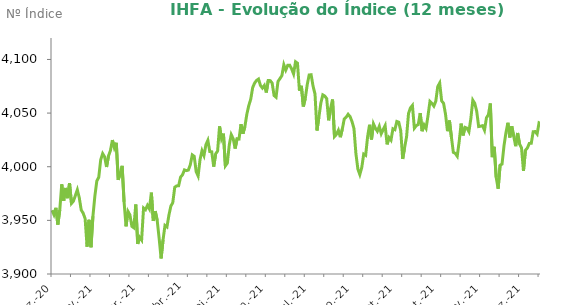
| Category | Series 0 |
|---|---|
| 2020-12-31 | 3959.42 |
| 2021-01-04 | 3955.28 |
| 2021-01-05 | 3961.68 |
| 2021-01-06 | 3946.08 |
| 2021-01-07 | 3959.91 |
| 2021-01-08 | 3983.61 |
| 2021-01-11 | 3968.18 |
| 2021-01-12 | 3980.22 |
| 2021-01-13 | 3970.68 |
| 2021-01-14 | 3984.72 |
| 2021-01-15 | 3965.79 |
| 2021-01-18 | 3967.89 |
| 2021-01-19 | 3973.23 |
| 2021-01-20 | 3978.48 |
| 2021-01-21 | 3971.03 |
| 2021-01-22 | 3959.66 |
| 2021-01-25 | 3956.69 |
| 2021-01-26 | 3951.66 |
| 2021-01-27 | 3925.52 |
| 2021-01-28 | 3950.5 |
| 2021-01-29 | 3924.94 |
| 2021-02-01 | 3953.82 |
| 2021-02-02 | 3972.6 |
| 2021-02-03 | 3986.69 |
| 2021-02-04 | 3990.2 |
| 2021-02-05 | 4006.56 |
| 2021-02-08 | 4012.28 |
| 2021-02-09 | 4009.25 |
| 2021-02-10 | 3999.73 |
| 2021-02-11 | 4010.06 |
| 2021-02-12 | 4015.12 |
| 2021-02-17 | 4024.82 |
| 2021-02-18 | 4017.66 |
| 2021-02-19 | 4022.34 |
| 2021-02-22 | 3987.76 |
| 2021-02-23 | 3993.76 |
| 2021-02-24 | 4000.86 |
| 2021-02-25 | 3967.23 |
| 2021-02-26 | 3944.47 |
| 2021-03-01 | 3958.31 |
| 2021-03-02 | 3955.07 |
| 2021-03-03 | 3944.44 |
| 2021-03-04 | 3943.1 |
| 2021-03-05 | 3964.81 |
| 2021-03-08 | 3928.07 |
| 2021-03-09 | 3934.21 |
| 2021-03-10 | 3931.67 |
| 2021-03-11 | 3961.52 |
| 2021-03-12 | 3959.95 |
| 2021-03-15 | 3963.95 |
| 2021-03-16 | 3960.68 |
| 2021-03-17 | 3975.84 |
| 2021-03-18 | 3949.49 |
| 2021-03-19 | 3958.61 |
| 2021-03-22 | 3949.93 |
| 2021-03-23 | 3933.15 |
| 2021-03-24 | 3914.5 |
| 2021-03-25 | 3931.89 |
| 2021-03-26 | 3945.28 |
| 2021-03-29 | 3943.87 |
| 2021-03-30 | 3954.78 |
| 2021-03-31 | 3963.24 |
| 2021-04-01 | 3966.52 |
| 2021-04-05 | 3980.85 |
| 2021-04-06 | 3982.14 |
| 2021-04-07 | 3982.23 |
| 2021-04-08 | 3990.34 |
| 2021-04-09 | 3992.5 |
| 2021-04-12 | 3997.03 |
| 2021-04-13 | 3996.38 |
| 2021-04-14 | 3996.89 |
| 2021-04-15 | 4001.89 |
| 2021-04-16 | 4011.06 |
| 2021-04-19 | 4009.7 |
| 2021-04-20 | 3995.43 |
| 2021-04-22 | 3991.36 |
| 2021-04-23 | 4006.88 |
| 2021-04-26 | 4014.86 |
| 2021-04-27 | 4010.42 |
| 2021-04-28 | 4020.49 |
| 2021-04-29 | 4024.6 |
| 2021-04-30 | 4014.13 |
| 2021-05-03 | 4013.92 |
| 2021-05-04 | 4000.09 |
| 2021-05-05 | 4012 |
| 2021-05-06 | 4014.61 |
| 2021-05-07 | 4037.62 |
| 2021-05-10 | 4026.17 |
| 2021-05-11 | 4030.82 |
| 2021-05-12 | 4000.86 |
| 2021-05-13 | 4003.37 |
| 2021-05-14 | 4020.47 |
| 2021-05-17 | 4029.9 |
| 2021-05-18 | 4026.19 |
| 2021-05-19 | 4016.94 |
| 2021-05-20 | 4026.11 |
| 2021-05-21 | 4025.85 |
| 2021-05-24 | 4039.62 |
| 2021-05-25 | 4030.75 |
| 2021-05-26 | 4037.36 |
| 2021-05-27 | 4048.85 |
| 2021-05-28 | 4056.99 |
| 2021-05-31 | 4062.88 |
| 2021-06-01 | 4073.78 |
| 2021-06-02 | 4078.02 |
| 2021-06-04 | 4080.46 |
| 2021-06-07 | 4081.73 |
| 2021-06-08 | 4075.77 |
| 2021-06-09 | 4073.34 |
| 2021-06-10 | 4075.79 |
| 2021-06-11 | 4069.2 |
| 2021-06-14 | 4080.4 |
| 2021-06-15 | 4080.27 |
| 2021-06-16 | 4077.96 |
| 2021-06-17 | 4066.35 |
| 2021-06-18 | 4064.81 |
| 2021-06-21 | 4079.53 |
| 2021-06-22 | 4082.14 |
| 2021-06-23 | 4084.93 |
| 2021-06-24 | 4095.07 |
| 2021-06-25 | 4090.09 |
| 2021-06-28 | 4094.54 |
| 2021-06-29 | 4094.67 |
| 2021-06-30 | 4091.19 |
| 2021-07-01 | 4086.52 |
| 2021-07-02 | 4097.86 |
| 2021-07-05 | 4096.51 |
| 2021-07-06 | 4070.87 |
| 2021-07-07 | 4075.44 |
| 2021-07-08 | 4056.16 |
| 2021-07-09 | 4063.56 |
| 2021-07-12 | 4076.5 |
| 2021-07-13 | 4085.56 |
| 2021-07-14 | 4085.78 |
| 2021-07-15 | 4075.11 |
| 2021-07-16 | 4067.77 |
| 2021-07-19 | 4033.75 |
| 2021-07-20 | 4046.31 |
| 2021-07-21 | 4059.3 |
| 2021-07-22 | 4066.98 |
| 2021-07-23 | 4065.91 |
| 2021-07-26 | 4063.49 |
| 2021-07-27 | 4043.27 |
| 2021-07-28 | 4054.41 |
| 2021-07-29 | 4062.71 |
| 2021-07-30 | 4028.14 |
| 2021-08-02 | 4030.13 |
| 2021-08-03 | 4033.93 |
| 2021-08-04 | 4027.52 |
| 2021-08-05 | 4034.98 |
| 2021-08-06 | 4044.43 |
| 2021-08-09 | 4046.2 |
| 2021-08-10 | 4048.89 |
| 2021-08-11 | 4046.7 |
| 2021-08-12 | 4042.07 |
| 2021-08-13 | 4035.54 |
| 2021-08-16 | 4012.2 |
| 2021-08-17 | 3997.84 |
| 2021-08-18 | 3992.73 |
| 2021-08-19 | 3999.27 |
| 2021-08-20 | 4011.78 |
| 2021-08-23 | 4010.67 |
| 2021-08-24 | 4028.05 |
| 2021-08-25 | 4039.1 |
| 2021-08-26 | 4025.41 |
| 2021-08-27 | 4040.01 |
| 2021-08-30 | 4035.92 |
| 2021-08-31 | 4033.08 |
| 2021-09-01 | 4037.66 |
| 2021-09-02 | 4030.79 |
| 2021-09-03 | 4034.61 |
| 2021-09-06 | 4038.27 |
| 2021-09-08 | 4020.87 |
| 2021-09-09 | 4027.15 |
| 2021-09-10 | 4024.8 |
| 2021-09-13 | 4035.39 |
| 2021-09-14 | 4034.54 |
| 2021-09-15 | 4042.17 |
| 2021-09-16 | 4041.49 |
| 2021-09-17 | 4033.61 |
| 2021-09-20 | 4007.25 |
| 2021-09-21 | 4018.04 |
| 2021-09-22 | 4027.91 |
| 2021-09-23 | 4049.69 |
| 2021-09-24 | 4054.89 |
| 2021-09-27 | 4057.13 |
| 2021-09-28 | 4035.95 |
| 2021-09-29 | 4038.34 |
| 2021-09-30 | 4039.3 |
| 2021-10-01 | 4050.05 |
| 2021-10-04 | 4033.15 |
| 2021-10-05 | 4038.94 |
| 2021-10-06 | 4035.78 |
| 2021-10-07 | 4047.57 |
| 2021-10-08 | 4060.84 |
| 2021-10-11 | 4059.07 |
| 2021-10-13 | 4056.52 |
| 2021-10-14 | 4061.11 |
| 2021-10-15 | 4074.77 |
| 2021-10-18 | 4078.05 |
| 2021-10-19 | 4061.42 |
| 2021-10-20 | 4059.05 |
| 2021-10-21 | 4048.86 |
| 2021-10-22 | 4033.16 |
| 2021-10-25 | 4043.06 |
| 2021-10-26 | 4027.86 |
| 2021-10-27 | 4013.41 |
| 2021-10-28 | 4012.41 |
| 2021-10-29 | 4009.78 |
| 2021-11-01 | 4023.42 |
| 2021-11-03 | 4040.16 |
| 2021-11-04 | 4029.18 |
| 2021-11-05 | 4036.69 |
| 2021-11-08 | 4035.95 |
| 2021-11-09 | 4032.66 |
| 2021-11-10 | 4045.02 |
| 2021-11-11 | 4062.03 |
| 2021-11-12 | 4059.02 |
| 2021-11-16 | 4051.69 |
| 2021-11-17 | 4037.47 |
| 2021-11-18 | 4037.78 |
| 2021-11-19 | 4038.26 |
| 2021-11-22 | 4034.06 |
| 2021-11-23 | 4045.6 |
| 2021-11-24 | 4048.5 |
| 2021-11-25 | 4058.96 |
| 2021-11-26 | 4008.94 |
| 2021-11-29 | 4018.61 |
| 2021-11-30 | 3990.07 |
| 2021-12-01 | 3979.51 |
| 2021-12-02 | 4001.4 |
| 2021-12-03 | 4002.43 |
| 2021-12-06 | 4019.49 |
| 2021-12-07 | 4031.65 |
| 2021-12-08 | 4040.97 |
| 2021-12-09 | 4027.29 |
| 2021-12-10 | 4037.68 |
| 2021-12-13 | 4028.23 |
| 2021-12-14 | 4019.14 |
| 2021-12-15 | 4031.45 |
| 2021-12-16 | 4021.15 |
| 2021-12-17 | 4017.55 |
| 2021-12-20 | 3996.12 |
| 2021-12-21 | 4015.29 |
| 2021-12-22 | 4017.47 |
| 2021-12-23 | 4021.73 |
| 2021-12-24 | 4021.88 |
| 2021-12-27 | 4032.68 |
| 2021-12-28 | 4032.76 |
| 2021-12-29 | 4030.47 |
| 2021-12-30 | 4040.91 |
| 2021-12-31 | 4040.03 |